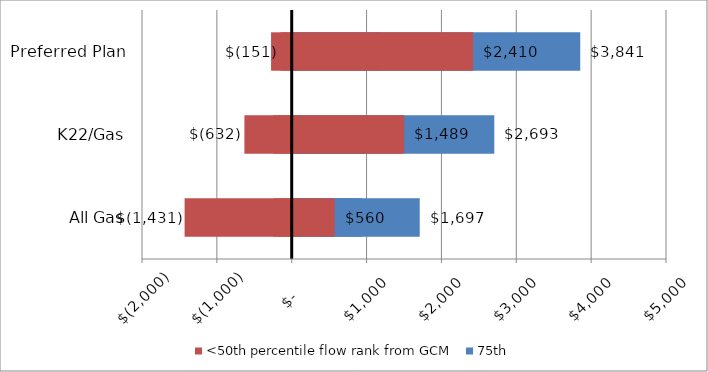
| Category | 25th | >50th percentile flow rank from GCM | <50th percentile flow rank from GCM | 75th | 50th |
|---|---|---|---|---|---|
| All Gas | -240 | 1697 | -1431 | 922 | 560 |
| K22/Gas | -244 | 2693 | -632 | 993 | 1489 |
| Preferred Plan | -276 | 3841 | -151 | 1186 | 2410 |